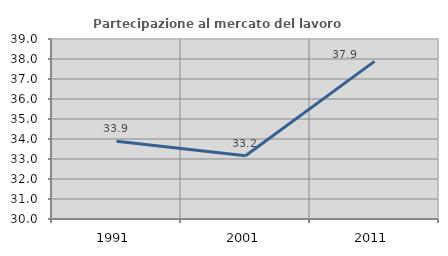
| Category | Partecipazione al mercato del lavoro  femminile |
|---|---|
| 1991.0 | 33.89 |
| 2001.0 | 33.162 |
| 2011.0 | 37.879 |